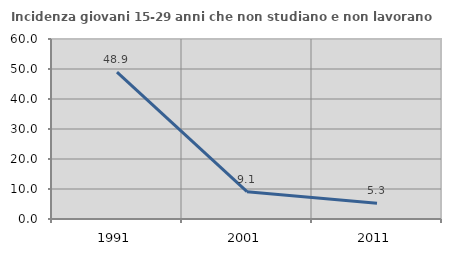
| Category | Incidenza giovani 15-29 anni che non studiano e non lavorano  |
|---|---|
| 1991.0 | 48.936 |
| 2001.0 | 9.091 |
| 2011.0 | 5.263 |